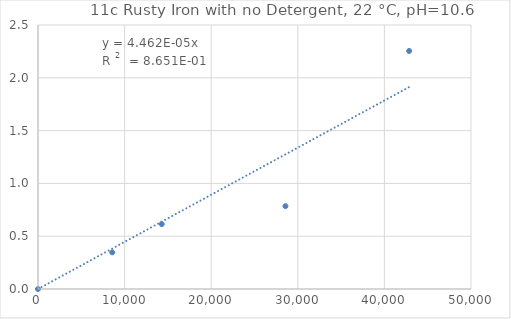
| Category | Series 0 |
|---|---|
| 0.0 | 0 |
| 8571.428571428572 | 0.347 |
| 14285.714285714286 | 0.615 |
| 28571.428571428572 | 0.784 |
| 42857.14285714286 | 2.254 |